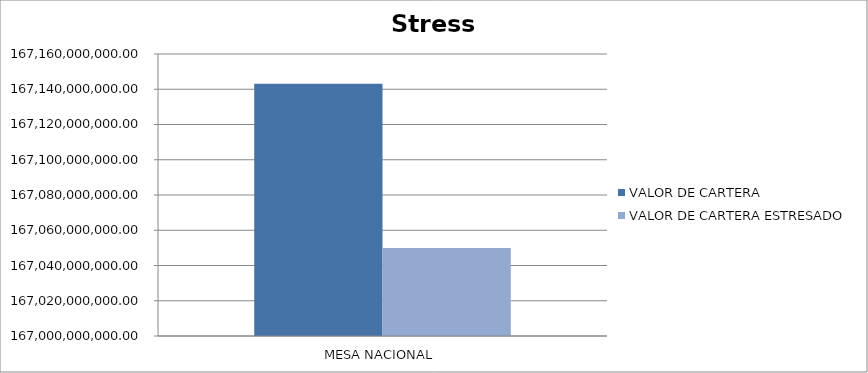
| Category | VALOR DE CARTERA | VALOR DE CARTERA ESTRESADO |
|---|---|---|
| MESA NACIONAL | 167143179737.301 | 167049980338.096 |